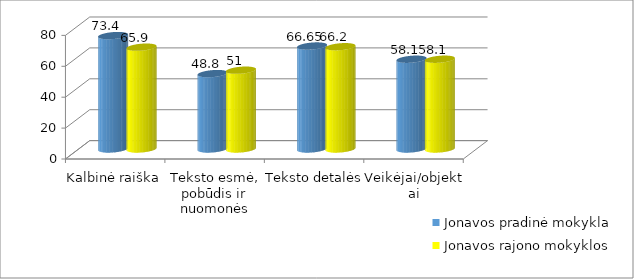
| Category | Jonavos pradinė mokykla | Jonavos rajono mokyklos |
|---|---|---|
| Kalbinė raiška | 73.4 | 65.9 |
| Teksto esmė, pobūdis ir nuomonės | 48.8 | 51 |
| Teksto detalės | 66.65 | 66.2 |
| Veikėjai/objektai | 58.1 | 58.1 |